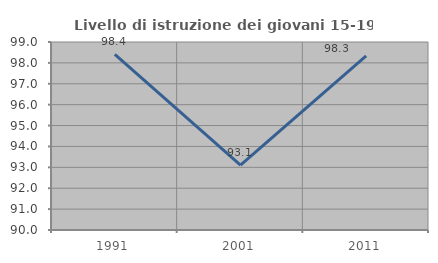
| Category | Livello di istruzione dei giovani 15-19 anni |
|---|---|
| 1991.0 | 98.413 |
| 2001.0 | 93.103 |
| 2011.0 | 98.333 |